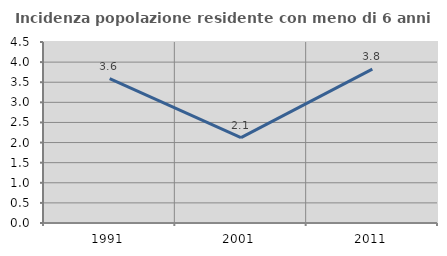
| Category | Incidenza popolazione residente con meno di 6 anni |
|---|---|
| 1991.0 | 3.591 |
| 2001.0 | 2.122 |
| 2011.0 | 3.825 |